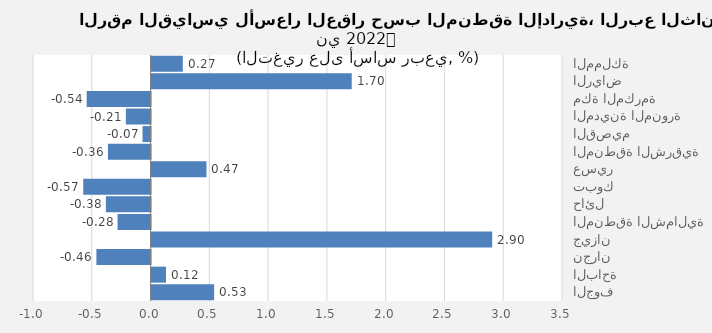
| Category | 2022 الربع الثاني |
|---|---|
| المملكة | 0.266 |
| الرياض | 1.703 |
| مكة المكرمة | -0.544 |
| المدينة المنورة | -0.21 |
| القصيم | -0.068 |
| المنطقة الشرقية | -0.363 |
| عسير | 0.467 |
| تبوك | -0.573 |
| حائل | -0.38 |
| المنطقة الشمالية | -0.281 |
| جيزان | 2.898 |
| نجران | -0.461 |
| الباحة | 0.123 |
| الجوف | 0.532 |